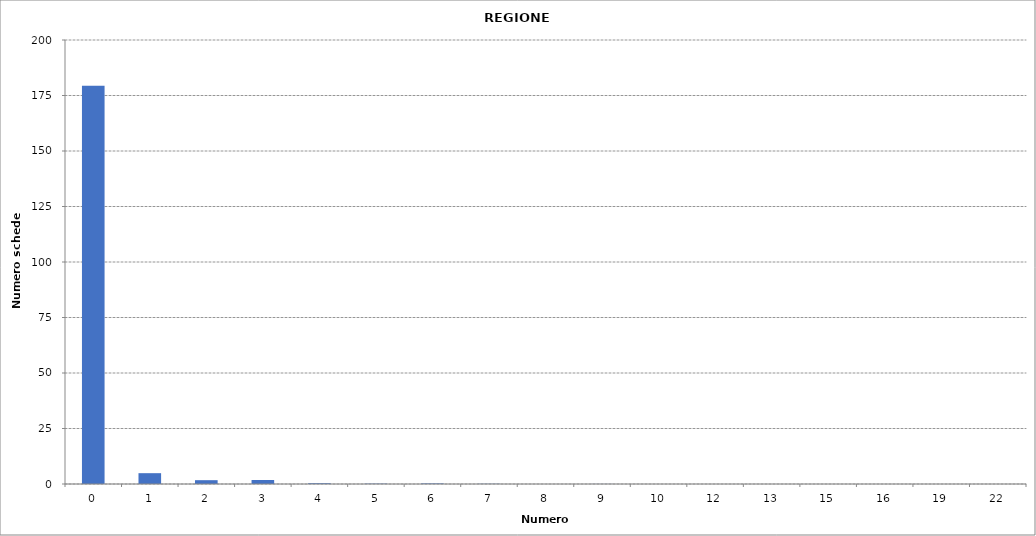
| Category | Series 0 |
|---|---|
| 0.0 | 179384 |
| 1.0 | 4875 |
| 2.0 | 1722 |
| 3.0 | 1793 |
| 4.0 | 350 |
| 5.0 | 153 |
| 6.0 | 248 |
| 7.0 | 95 |
| 8.0 | 3 |
| 9.0 | 36 |
| 10.0 | 11 |
| 12.0 | 7 |
| 13.0 | 7 |
| 15.0 | 1 |
| 16.0 | 1 |
| 19.0 | 4 |
| 22.0 | 2 |